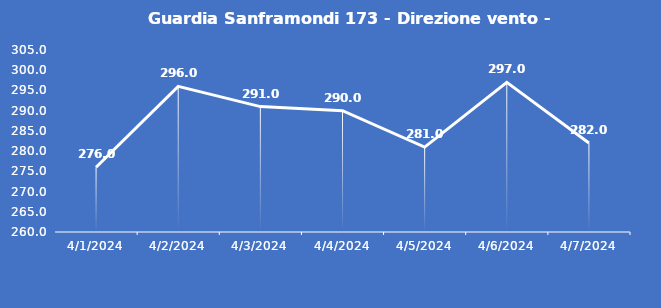
| Category | Guardia Sanframondi 173 - Direzione vento - Grezzo (°N) |
|---|---|
| 4/1/24 | 276 |
| 4/2/24 | 296 |
| 4/3/24 | 291 |
| 4/4/24 | 290 |
| 4/5/24 | 281 |
| 4/6/24 | 297 |
| 4/7/24 | 282 |